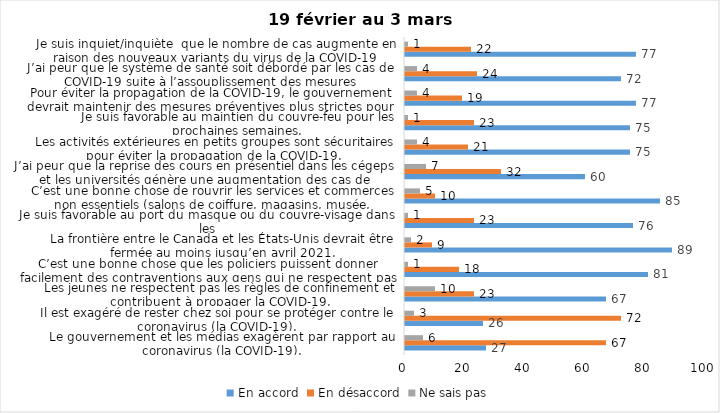
| Category | En accord | En désaccord | Ne sais pas |
|---|---|---|---|
| Le gouvernement et les médias exagèrent par rapport au coronavirus (la COVID-19). | 27 | 67 | 6 |
| Il est exagéré de rester chez soi pour se protéger contre le coronavirus (la COVID-19). | 26 | 72 | 3 |
| Les jeunes ne respectent pas les règles de confinement et contribuent à propager la COVID-19. | 67 | 23 | 10 |
| C’est une bonne chose que les policiers puissent donner facilement des contraventions aux gens qui ne respectent pas les mesures pour prévenir le coronavirus (la COVID-19). | 81 | 18 | 1 |
| La frontière entre le Canada et les États-Unis devrait être fermée au moins jusqu’en avril 2021. | 89 | 9 | 2 |
| Je suis favorable au port du masque ou du couvre-visage dans les
lieux publics extérieurs achalandés (ex. rues, parcs) | 76 | 23 | 1 |
| C’est une bonne chose de rouvrir les services et commerces non essentiels (salons de coiffure, magasins, musée, industries) à partir du 8 février 2021. | 85 | 10 | 5 |
| J’ai peur que la reprise des cours en présentiel dans les cégeps et les universités génère une augmentation des cas de COVID-19. | 60 | 32 | 7 |
| Les activités extérieures en petits groupes sont sécuritaires pour éviter la propagation de la COVID-19. | 75 | 21 | 4 |
| Je suis favorable au maintien du couvre-feu pour les prochaines semaines. | 75 | 23 | 1 |
| Pour éviter la propagation de la COVID-19, le gouvernement devrait maintenir des mesures préventives plus strictes pour la grande région de Montréal. | 77 | 19 | 4 |
| J’ai peur que le système de santé soit débordé par les cas de COVID-19 suite à l’assouplissement des mesures | 72 | 24 | 4 |
| Je suis inquiet/inquiète  que le nombre de cas augmente en raison des nouveaux variants du virus de la COVID-19 | 77 | 22 | 1 |